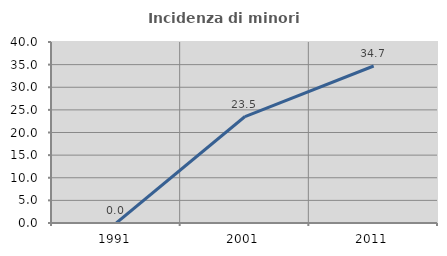
| Category | Incidenza di minori stranieri |
|---|---|
| 1991.0 | 0 |
| 2001.0 | 23.529 |
| 2011.0 | 34.694 |